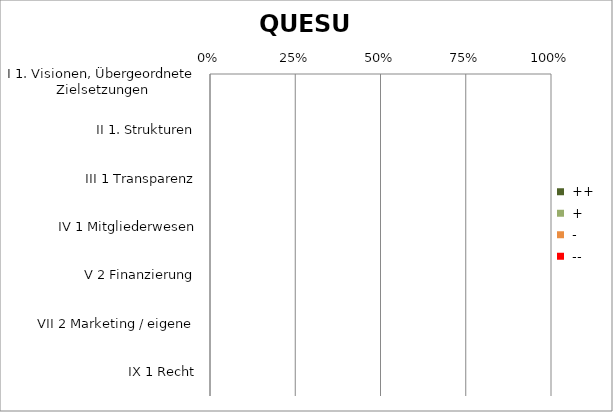
| Category |  ++ |  + |  - |  -- |
|---|---|---|---|---|
| I 1. Visionen, Übergeordnete Zielsetzungen | 0 | 0 | 0 | 0 |
| I 2. Politik, Strategie und Ausrichtung | 0 | 0 | 0 | 0 |
| I 3. Politik, Strategie und Ausrichtung | 0 | 0 | 0 | 0 |
| II 1. Strukturen | 0 | 0 | 0 | 0 |
| II 2. Abläufe und Prozesse | 0 | 0 | 0 | 0 |
| II 3. Abläufe und Prozesse | 0 | 0 | 0 | 0 |
| III 1 Transparenz | 0 | 0 | 0 | 0 |
| III 2 Maßnahmen zur Stabilität des Verrechungssystems | 0 | 0 | 0 | 0 |
| III 3 Bezug zur Landeswährung | 0 | 0 | 0 | 0 |
| IV 1 Mitgliederwesen | 0 | 0 | 0 | 0 |
| IV 2 Mitgestaltung | 0 | 0 | 0 | 0 |
| V 1 Finanzverwaltung | 0 | 0 | 0 | 0 |
| V 2 Finanzierung | 0 | 0 | 0 | 0 |
| VI 1 Ziele / Kennzahlen | 0 | 0 | 0 | 0 |
| VII 1 Marketing | 0 | 0 | 0 | 0 |
| VII 2 Marketing / eigene | 0 | 0 | 0 | 0 |
| VIII 1 Vernetzung in der eigenen Region | 0 | 0 | 0 | 0 |
| VIII 2 Vernetzung zu anderen Tauschsystemen | 0 | 0 | 0 | 0 |
| IX 1 Recht | 0 | 0 | 0 | 0 |
| IX Eigene Rechtsbereiche | 0 | 0 | 0 | 0 |